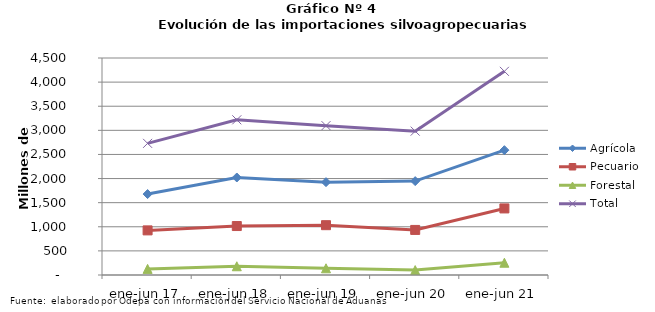
| Category | Agrícola | Pecuario | Forestal | Total |
|---|---|---|---|---|
| ene-jun 17 | 1678339 | 925093 | 126474 | 2729906 |
| ene-jun 18 | 2021970 | 1015247 | 181181 | 3218398 |
| ene-jun 19 | 1925212 | 1033021 | 139177 | 3097410 |
| ene-jun 20 | 1947039 | 934577 | 101852 | 2983468 |
| ene-jun 21 | 2588696 | 1380463 | 254406 | 4223565 |